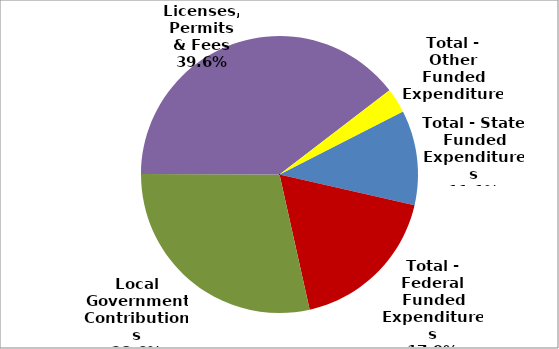
| Category | Series 0 |
|---|---|
| Total - State Funded Expenditures | 20526366 |
| Total - Federal Funded Expenditures | 33274611 |
| Local Government Contributions | 52966773 |
| Licenses, Permits & Fees | 73371847 |
| Total - Other Funded Expenditures | 5368566 |